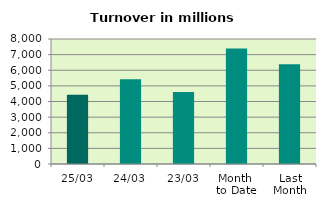
| Category | Series 0 |
|---|---|
| 25/03 | 4439.723 |
| 24/03 | 5418.36 |
| 23/03 | 4603.217 |
| Month 
to Date | 7396.433 |
| Last
Month | 6378.947 |